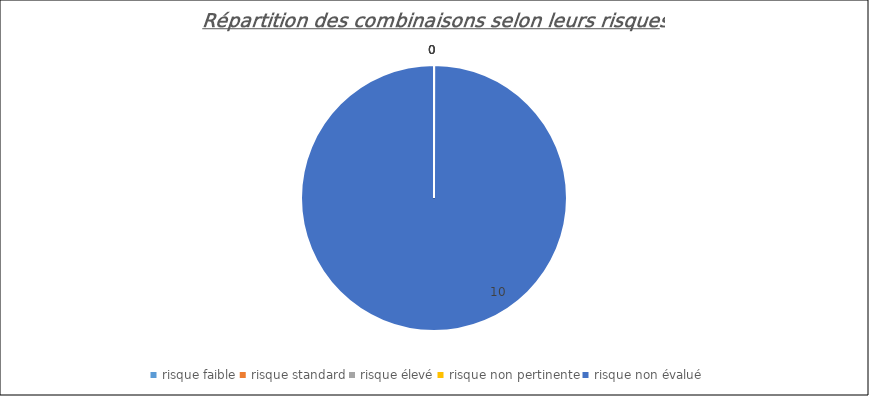
| Category | Series 0 |
|---|---|
| risque faible | 0 |
| risque standard | 0 |
| risque élevé | 0 |
| risque non pertinente | 0 |
| risque non évalué | 10 |